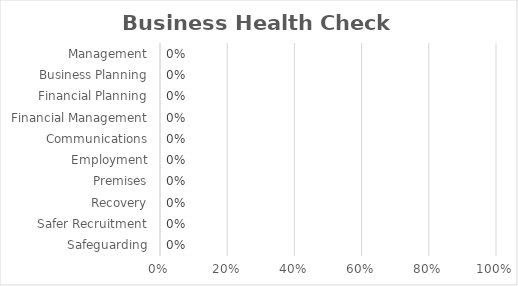
| Category | Series 0 |
|---|---|
| Management | 0 |
| Business Planning | 0 |
| Financial Planning | 0 |
| Financial Management | 0 |
| Communications | 0 |
| Employment | 0 |
| Premises | 0 |
| Recovery | 0 |
| Safer Recruitment | 0 |
| Safeguarding | 0 |